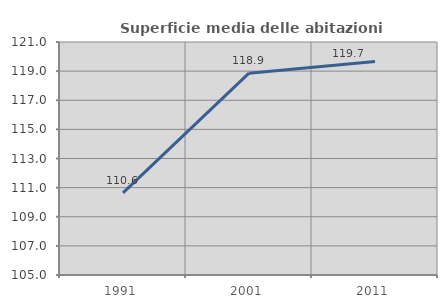
| Category | Superficie media delle abitazioni occupate |
|---|---|
| 1991.0 | 110.636 |
| 2001.0 | 118.859 |
| 2011.0 | 119.659 |